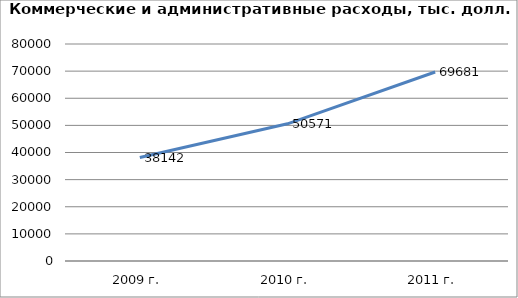
| Category | Series 0 |
|---|---|
| 2009 г. | 38142 |
| 2010 г. | 50571 |
| 2011 г. | 69681 |